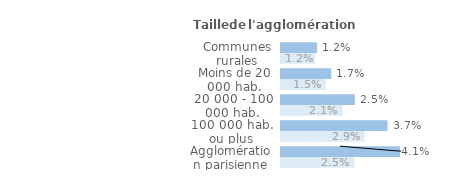
| Category | Series 1 | Series 0 |
|---|---|---|
| Communes rurales | 0.012 | 0.012 |
| Moins de 20 000 hab. | 0.017 | 0.015 |
| 20 000 - 100 000 hab. | 0.025 | 0.021 |
| 100 000 hab. ou plus | 0.037 | 0.029 |
| Agglomération parisienne | 0.041 | 0.025 |